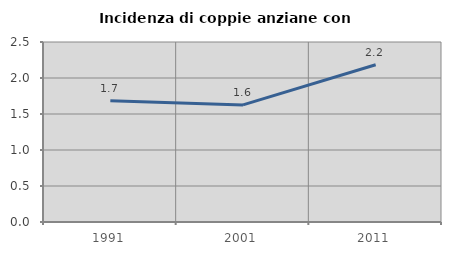
| Category | Incidenza di coppie anziane con figli |
|---|---|
| 1991.0 | 1.684 |
| 2001.0 | 1.626 |
| 2011.0 | 2.183 |